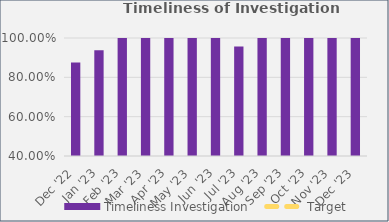
| Category | Timeliness Investigation |
|---|---|
| Dec '22 | 0.875 |
| Jan '23 | 0.938 |
| Feb '23 | 1 |
| Mar '23 | 1 |
| Apr '23 | 1 |
| May '23 | 1 |
| Jun '23 | 1 |
| Jul '23 | 0.957 |
| Aug '23 | 1 |
| Sep '23 | 1 |
| Oct '23 | 1 |
| Nov '23 | 1 |
| Dec '23 | 1 |